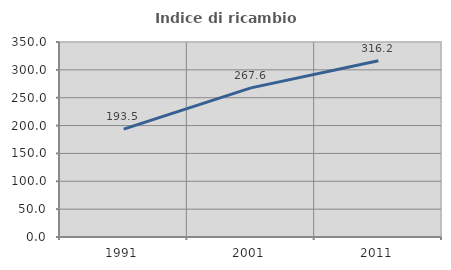
| Category | Indice di ricambio occupazionale  |
|---|---|
| 1991.0 | 193.506 |
| 2001.0 | 267.606 |
| 2011.0 | 316.216 |